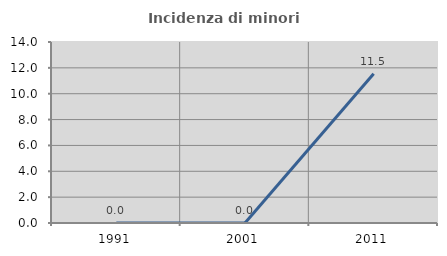
| Category | Incidenza di minori stranieri |
|---|---|
| 1991.0 | 0 |
| 2001.0 | 0 |
| 2011.0 | 11.538 |